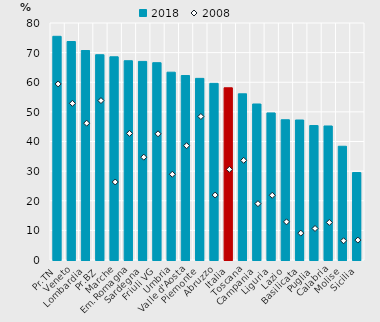
| Category | 2018 |
|---|---|
| Pr.TN | 75.507 |
| Veneto | 73.752 |
| Lombardia | 70.71 |
| Pr.BZ | 69.292 |
| Marche | 68.592 |
| Em.Romagna | 67.266 |
| Sardegna | 67.035 |
| Friuli VG | 66.607 |
| Umbria | 63.395 |
| Valle d'Aosta | 62.27 |
| Piemonte | 61.31 |
| Abruzzo | 59.629 |
| Italia | 58.133 |
| Toscana | 56.097 |
| Campania | 52.659 |
| Liguria | 49.647 |
| Lazio | 47.34 |
| Basilicata | 47.257 |
| Puglia | 45.396 |
| Calabria | 45.24 |
| Molise | 38.392 |
| Sicilia | 29.529 |